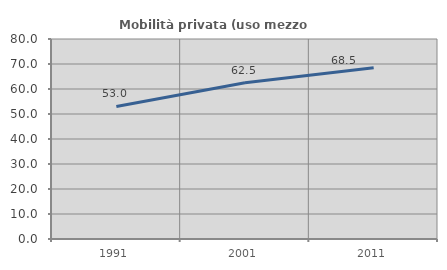
| Category | Mobilità privata (uso mezzo privato) |
|---|---|
| 1991.0 | 53.023 |
| 2001.0 | 62.533 |
| 2011.0 | 68.543 |